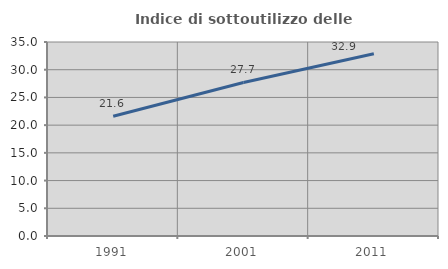
| Category | Indice di sottoutilizzo delle abitazioni  |
|---|---|
| 1991.0 | 21.596 |
| 2001.0 | 27.697 |
| 2011.0 | 32.872 |